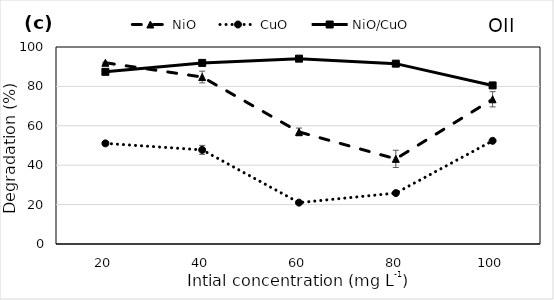
| Category | NiO  | CuO  | NiO/CuO  |
|---|---|---|---|
| 20.0 | 92 | 51.083 | 87.396 |
| 40.0 | 84.756 | 47.771 | 91.928 |
| 60.0 | 56.878 | 21 | 94.089 |
| 80.0 | 43.214 | 25.842 | 91.552 |
| 100.0 | 73.468 | 52.37 | 80.5 |